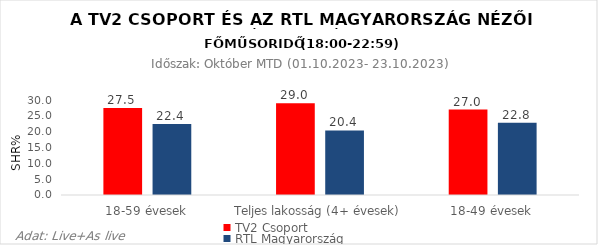
| Category | TV2 Csoport | RTL Magyarország |
|---|---|---|
| 18-59 évesek | 27.5 | 22.4 |
| Teljes lakosság (4+ évesek) | 29 | 20.4 |
| 18-49 évesek | 27 | 22.8 |